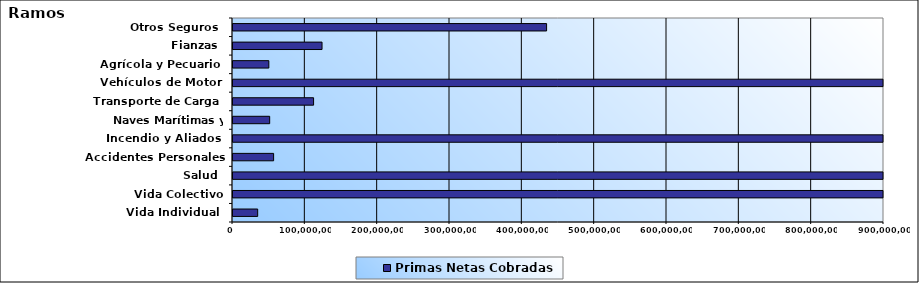
| Category | Primas Netas Cobradas |
|---|---|
| Vida Individual  | 34109230.69 |
| Vida Colectivo | 1234530317.47 |
| Salud  | 1929333959.66 |
| Accidentes Personales | 56156052.51 |
| Incendio y Aliados  | 1639136354.98 |
| Naves Marítimas y Aéreas  | 50705470.92 |
| Transporte de Carga  | 111399690.99 |
| Vehículos de Motor  | 1752161573.27 |
| Agrícola y Pecuario  | 49549222.75 |
| Fianzas  | 123091796.68 |
| Otros Seguros  | 433545943.09 |